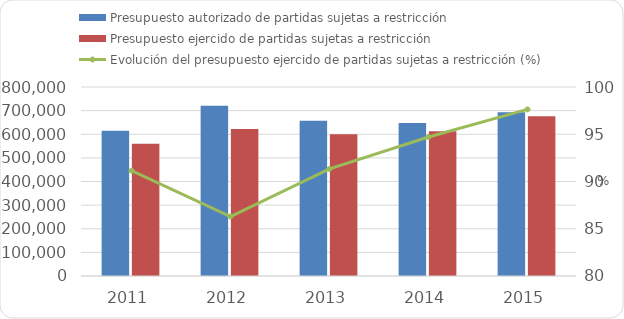
| Category | Presupuesto autorizado de partidas sujetas a restricción | Presupuesto ejercido de partidas sujetas a restricción  |
|---|---|---|
| 2011 | 614651 | 560225 |
| 2012 | 720679.2 | 621909.5 |
| 2013 | 657148.1 | 600163.1 |
| 2014 | 647302.9 | 613052.1 |
| 2015 | 692840.462 | 676403.338 |